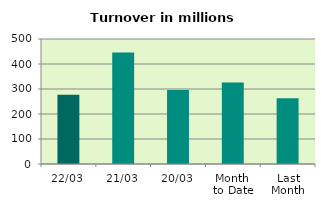
| Category | Series 0 |
|---|---|
| 22/03 | 276.686 |
| 21/03 | 445.818 |
| 20/03 | 296.394 |
| Month 
to Date | 325.939 |
| Last
Month | 263.32 |